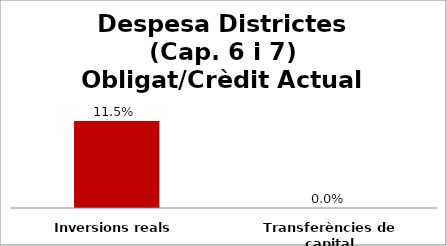
| Category | Series 0 |
|---|---|
| Inversions reals | 0.115 |
| Transferències de capital | 0 |